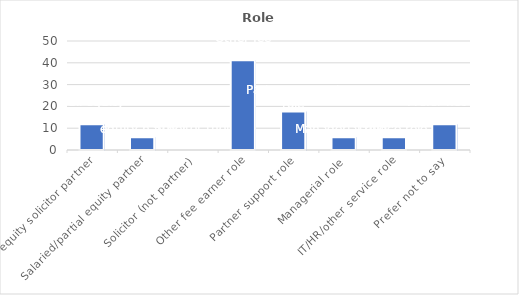
| Category | % |
|---|---|
| Full equity solicitor partner | 11.765 |
| Salaried/partial equity partner | 5.882 |
| Solicitor (not partner) | 0 |
| Other fee earner role | 41.176 |
| Partner support role | 17.647 |
| Managerial role | 5.882 |
| IT/HR/other service role | 5.882 |
| Prefer not to say  | 11.765 |